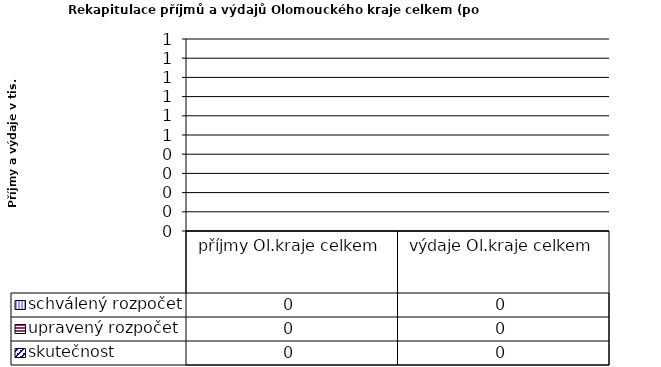
| Category | schválený rozpočet | upravený rozpočet | skutečnost |
|---|---|---|---|
| příjmy Ol.kraje celkem | 0 | 0 | 0 |
| výdaje Ol.kraje celkem | 0 | 0 | 0 |